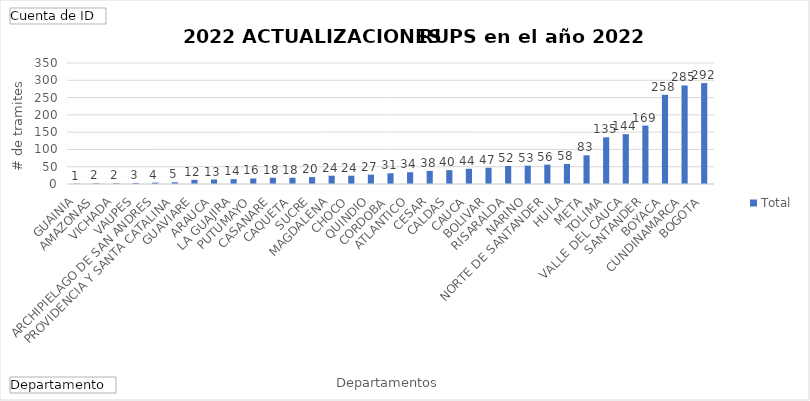
| Category | Total |
|---|---|
| GUAINIA | 1 |
| AMAZONAS | 2 |
| VICHADA | 2 |
| VAUPES | 3 |
| ARCHIPIELAGO DE SAN ANDRES, PROVIDENCIA Y SANTA CATALINA | 4 |
| GUAVIARE | 5 |
| ARAUCA | 12 |
| LA GUAJIRA | 13 |
| PUTUMAYO | 14 |
| CASANARE | 16 |
| CAQUETA | 18 |
| SUCRE | 18 |
| MAGDALENA | 20 |
| CHOCO | 24 |
| QUINDIO | 24 |
| CORDOBA | 27 |
| ATLANTICO | 31 |
| CESAR | 34 |
| CALDAS | 38 |
| CAUCA | 40 |
| BOLIVAR | 44 |
| RISARALDA | 47 |
| NARINO | 52 |
| NORTE DE SANTANDER | 53 |
| HUILA | 56 |
| META | 58 |
| TOLIMA | 83 |
| VALLE DEL CAUCA | 135 |
| SANTANDER | 144 |
| BOYACA | 169 |
| CUNDINAMARCA | 258 |
| BOGOTA, D.C. | 285 |
| ANTIOQUIA | 292 |